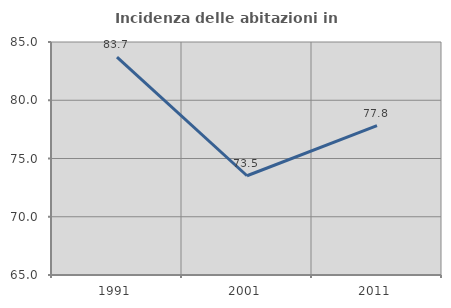
| Category | Incidenza delle abitazioni in proprietà  |
|---|---|
| 1991.0 | 83.696 |
| 2001.0 | 73.52 |
| 2011.0 | 77.816 |